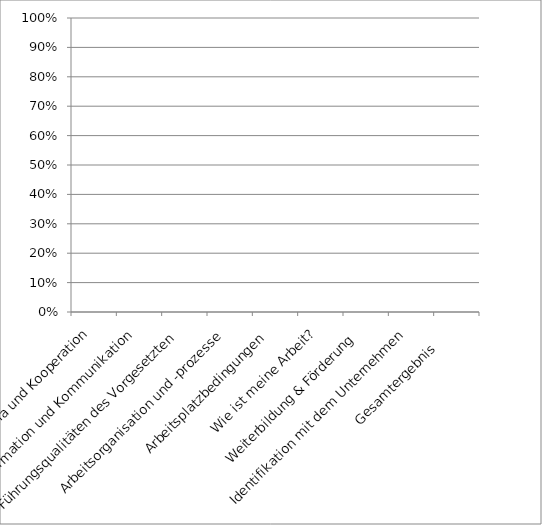
| Category | Series 0 |
|---|---|
| Klima und Kooperation | 0 |
| Information und Kommunikation | 0 |
| Führungsqualitäten des Vorgesetzten | 0 |
| Arbeitsorganisation und -prozesse | 0 |
| Arbeitsplatzbedingungen  | 0 |
| Wie ist meine Arbeit? | 0 |
| Weiterbildung & Förderung  | 0 |
| Identifikation mit dem Unternehmen | 0 |
| Gesamtergebnis      | 0 |